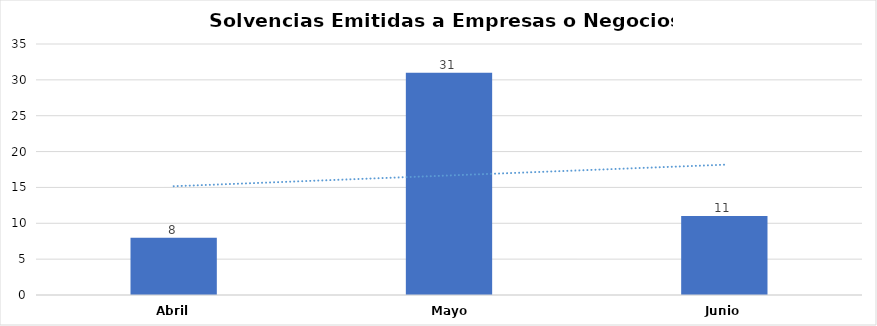
| Category | Series 0 |
|---|---|
| Abril  | 8 |
| Mayo  | 31 |
| Junio | 11 |